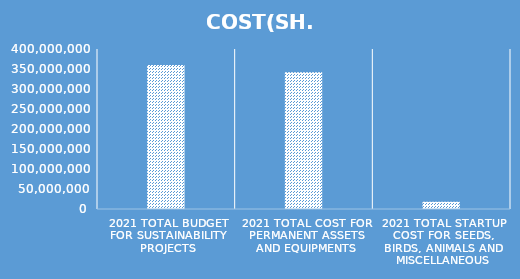
| Category | COST(SH.) |
|---|---|
| 2021 TOTAL BUDGET FOR SUSTAINABILITY PROJECTS | 360000000 |
| 2021 TOTAL COST FOR PERMANENT ASSETS AND EQUIPMENTS | 342180000 |
| 2021 TOTAL STARTUP COST FOR SEEDS, BIRDS, ANIMALS AND MISCELLANEOUS | 17820000 |